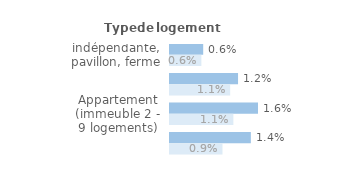
| Category | Series 1 | Series 0 |
|---|---|---|
| Maison indépendante, pavillon, ferme | 0.006 | 0.006 |
| Maison de ville groupée | 0.012 | 0.011 |
| Appartement (immeuble 2 - 9 logements) | 0.016 | 0.011 |
| Appartement (immeuble de 10 logements ou +) | 0.014 | 0.009 |